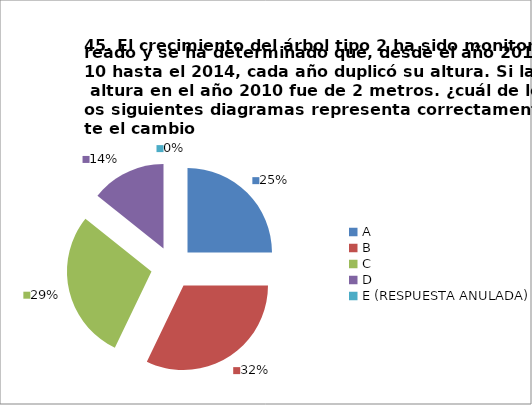
| Category | CANTIDAD DE RESPUESTAS PREGUNTA (45) | PORCENTAJE |
|---|---|---|
| A | 7 | 0.25 |
| B | 9 | 0.321 |
| C | 8 | 0.286 |
| D | 4 | 0.143 |
| E (RESPUESTA ANULADA) | 0 | 0 |